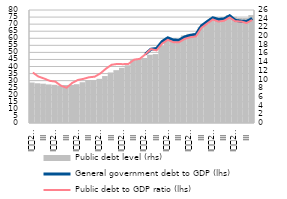
| Category | Public debt level (rhs) |
|---|---|
| I
2007 | 9.315 |
| II | 9.136 |
| III | 9.044 |
| IV | 8.875 |
| I
2008 | 8.788 |
| II | 8.624 |
| III | 8.74 |
| IV | 8.781 |
| I
2009 | 8.932 |
| II | 9.379 |
| III | 9.867 |
| IV | 9.849 |
| I
2010 | 10.169 |
| II | 10.802 |
| III | 11.623 |
| IV | 12.157 |
| I
2011 | 12.696 |
| II | 13.287 |
| III | 14.745 |
| IV | 14.784 |
| I
2012 | 14.956 |
| II | 15.707 |
| III | 15.852 |
| IV | 17.717 |
| I
2013 | 19.388 |
| II | 18.903 |
| III | 19.074 |
| IV | 20.141 |
| I
2014 | 20.507 |
| II | 20.66 |
| III | 22.114 |
| IV | 22.757 |
| I
2015 | 24.193 |
| II | 23.775 |
| III | 24.063 |
| IV | 24.801 |
| I
2016 | 24.441 |
| II | 24.182 |
| III | 24.146 |
| IV | 24.822 |